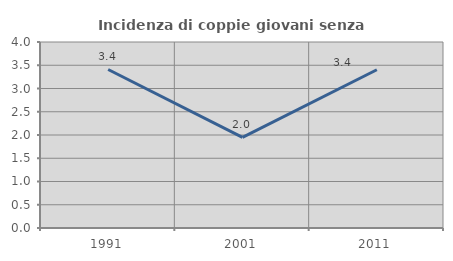
| Category | Incidenza di coppie giovani senza figli |
|---|---|
| 1991.0 | 3.409 |
| 2001.0 | 1.95 |
| 2011.0 | 3.404 |